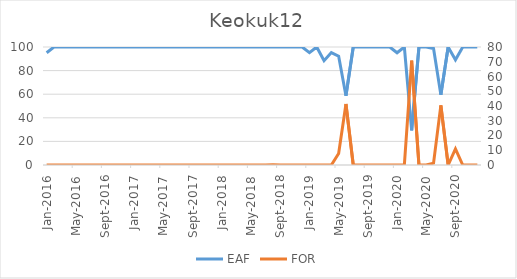
| Category | EAF |
|---|---|
| 2016-01-01 | 95.09 |
| 2016-02-01 | 100 |
| 2016-03-01 | 100 |
| 2016-04-01 | 100 |
| 2016-05-01 | 100 |
| 2016-06-01 | 100 |
| 2016-07-01 | 100 |
| 2016-08-01 | 100 |
| 2016-09-01 | 100 |
| 2016-10-01 | 100 |
| 2016-11-01 | 100 |
| 2016-12-01 | 100 |
| 2017-01-01 | 100 |
| 2017-02-01 | 100 |
| 2017-03-01 | 100 |
| 2017-04-01 | 100 |
| 2017-05-01 | 100 |
| 2017-06-01 | 99.98 |
| 2017-07-01 | 100 |
| 2017-08-01 | 100 |
| 2017-09-01 | 100 |
| 2017-10-01 | 100 |
| 2017-11-01 | 100 |
| 2017-12-01 | 100 |
| 2018-01-01 | 100 |
| 2018-02-01 | 100 |
| 2018-03-01 | 100 |
| 2018-04-01 | 100 |
| 2018-05-01 | 100 |
| 2018-06-01 | 100 |
| 2018-07-01 | 100 |
| 2018-08-01 | 99.91 |
| 2018-09-01 | 100 |
| 2018-10-01 | 100 |
| 2018-11-01 | 100 |
| 2018-12-01 | 100 |
| 2019-01-01 | 95.28 |
| 2019-02-01 | 100 |
| 2019-03-01 | 88.44 |
| 2019-04-01 | 95.26 |
| 2019-05-01 | 92.2 |
| 2019-06-01 | 58.65 |
| 2019-07-01 | 100 |
| 2019-08-01 | 100 |
| 2019-09-01 | 100 |
| 2019-10-01 | 100 |
| 2019-11-01 | 100 |
| 2019-12-01 | 100 |
| 2020-01-01 | 95.12 |
| 2020-02-01 | 100 |
| 2020-03-01 | 29.25 |
| 2020-04-01 | 100 |
| 2020-05-01 | 100 |
| 2020-06-01 | 98.74 |
| 2020-07-01 | 59.59 |
| 2020-08-01 | 100 |
| 2020-09-01 | 89.11 |
| 2020-10-01 | 100 |
| 2020-11-01 | 100 |
| 2020-12-01 | 100 |